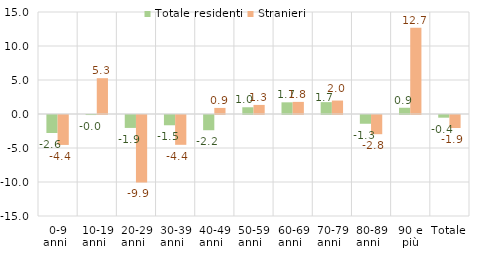
| Category | Totale residenti | Stranieri |
|---|---|---|
| 0-9 anni   | -2.645 | -4.403 |
| 10-19 anni   | -0.005 | 5.265 |
| 20-29 anni   | -1.9 | -9.923 |
| 30-39 anni   | -1.509 | -4.384 |
| 40-49 anni   | -2.238 | 0.894 |
| 50-59 anni   | 0.99 | 1.334 |
| 60-69 anni   | 1.717 | 1.78 |
| 70-79 anni   | 1.742 | 1.978 |
| 80-89 anni   | -1.287 | -2.824 |
| 90 e più | 0.918 | 12.698 |
| Totale   | -0.395 | -1.914 |